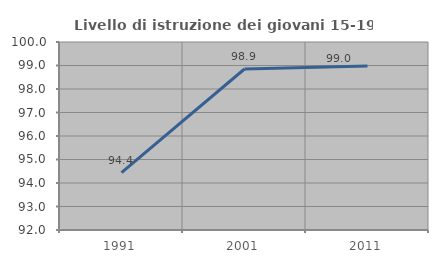
| Category | Livello di istruzione dei giovani 15-19 anni |
|---|---|
| 1991.0 | 94.444 |
| 2001.0 | 98.851 |
| 2011.0 | 98.98 |